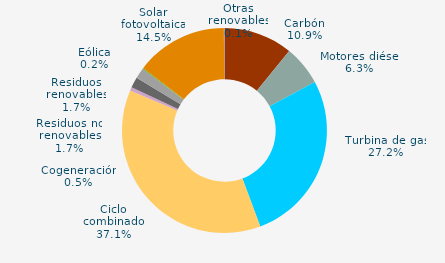
| Category | Series 0 |
|---|---|
| Carbón | 10.867 |
| Motores diésel | 6.281 |
| Turbina de gas | 27.173 |
| Ciclo combinado | 37.076 |
| Generación auxiliar | 0 |
| Cogeneración | 0.519 |
| Residuos no renovables | 1.685 |
| Residuos renovables | 1.685 |
| Eólica | 0.161 |
| Solar fotovoltaica | 14.457 |
| Otras renovables | 0.096 |